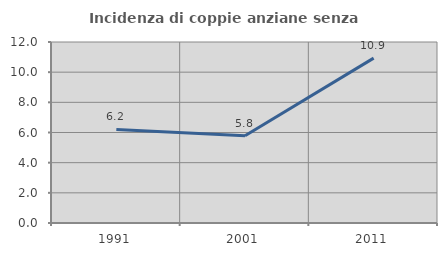
| Category | Incidenza di coppie anziane senza figli  |
|---|---|
| 1991.0 | 6.203 |
| 2001.0 | 5.781 |
| 2011.0 | 10.931 |